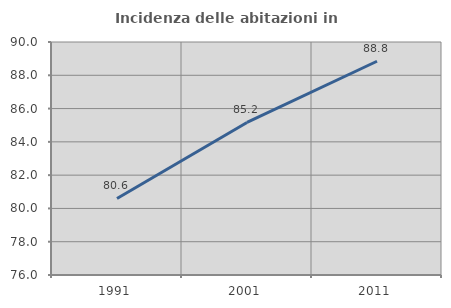
| Category | Incidenza delle abitazioni in proprietà  |
|---|---|
| 1991.0 | 80.597 |
| 2001.0 | 85.167 |
| 2011.0 | 88.843 |